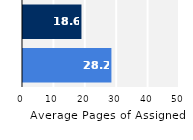
| Category | Series 0 |
|---|---|
| Upper Division | 28.158 |
| Lower Division | 18.617 |